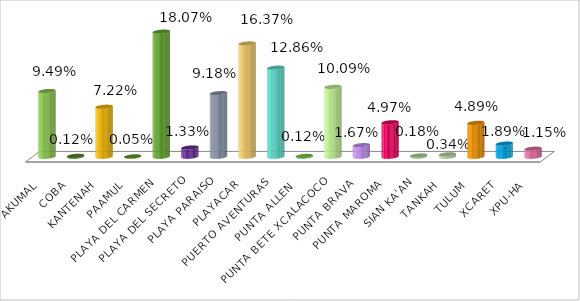
| Category | AKUMAL COBA KANTENAH PAAMUL PLAYA DEL CARMEN PLAYA DEL SECRETO PLAYA PARAISO PLAYACAR PUERTO AVENTURAS PUNTA ALLEN  PUNTA BETE XCALACOCO PUNTA BRAVA PUNTA MAROMA SIAN KA'AN TANKAH TULUM XCARET XPU-HA |
|---|---|
| AKUMAL | 0.095 |
| COBA | 0.001 |
| KANTENAH | 0.072 |
| PAAMUL | 0 |
| PLAYA DEL CARMEN | 0.181 |
| PLAYA DEL SECRETO | 0.013 |
| PLAYA PARAISO | 0.092 |
| PLAYACAR | 0.164 |
| PUERTO AVENTURAS | 0.129 |
| PUNTA ALLEN  | 0.001 |
| PUNTA BETE XCALACOCO | 0.101 |
| PUNTA BRAVA | 0.017 |
| PUNTA MAROMA | 0.05 |
| SIAN KA'AN | 0.002 |
| TANKAH | 0.003 |
| TULUM | 0.049 |
| XCARET | 0.019 |
| XPU-HA | 0.012 |